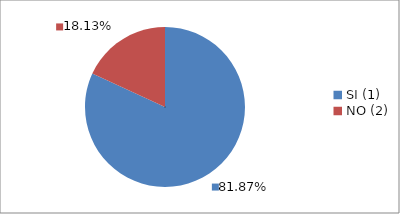
| Category | Series 0 |
|---|---|
| SI (1) | 0.819 |
| NO (2) | 0.181 |